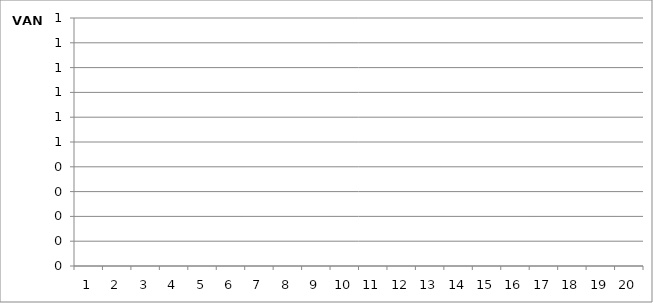
| Category | Series 0 |
|---|---|
| 1.0 | 0 |
| 2.0 | 0 |
| 3.0 | 0 |
| 4.0 | 0 |
| 5.0 | 0 |
| 6.0 | 0 |
| 7.0 | 0 |
| 8.0 | 0 |
| 9.0 | 0 |
| 10.0 | 0 |
| 11.0 | 0 |
| 12.0 | 0 |
| 13.0 | 0 |
| 14.0 | 0 |
| 15.0 | 0 |
| 16.0 | 0 |
| 17.0 | 0 |
| 18.0 | 0 |
| 19.0 | 0 |
| 20.0 | 0 |